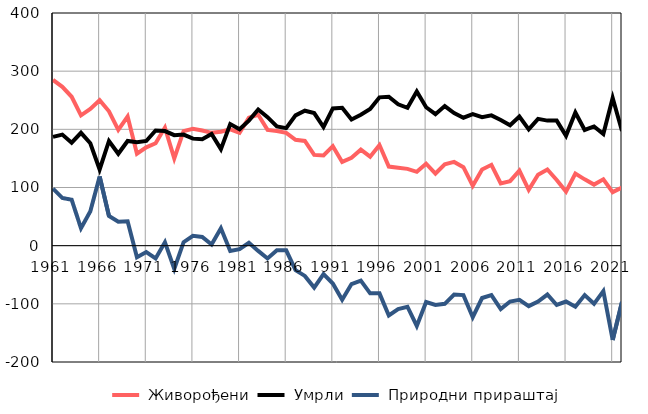
| Category |  Живорођени |  Умрли |  Природни прираштај |
|---|---|---|---|
| 1961.0 | 285 | 187 | 98 |
| 1962.0 | 273 | 191 | 82 |
| 1963.0 | 256 | 177 | 79 |
| 1964.0 | 224 | 194 | 30 |
| 1965.0 | 235 | 176 | 59 |
| 1966.0 | 250 | 131 | 119 |
| 1967.0 | 231 | 180 | 51 |
| 1968.0 | 199 | 158 | 41 |
| 1969.0 | 222 | 180 | 42 |
| 1970.0 | 158 | 178 | -20 |
| 1971.0 | 169 | 180 | -11 |
| 1972.0 | 176 | 198 | -22 |
| 1973.0 | 203 | 197 | 6 |
| 1974.0 | 150 | 190 | -40 |
| 1975.0 | 197 | 191 | 6 |
| 1976.0 | 201 | 184 | 17 |
| 1977.0 | 198 | 183 | 15 |
| 1978.0 | 194 | 192 | 2 |
| 1979.0 | 196 | 166 | 30 |
| 1980.0 | 200 | 209 | -9 |
| 1981.0 | 194 | 200 | -6 |
| 1982.0 | 220 | 215 | 5 |
| 1983.0 | 225 | 234 | -9 |
| 1984.0 | 199 | 221 | -22 |
| 1985.0 | 197 | 205 | -8 |
| 1986.0 | 194 | 202 | -8 |
| 1987.0 | 182 | 224 | -42 |
| 1988.0 | 180 | 232 | -52 |
| 1989.0 | 156 | 228 | -72 |
| 1990.0 | 155 | 204 | -49 |
| 1991.0 | 171 | 236 | -65 |
| 1992.0 | 144 | 237 | -93 |
| 1993.0 | 151 | 217 | -66 |
| 1994.0 | 165 | 225 | -60 |
| 1995.0 | 153 | 235 | -82 |
| 1996.0 | 173 | 255 | -82 |
| 1997.0 | 136 | 256 | -120 |
| 1998.0 | 134 | 243 | -109 |
| 1999.0 | 132 | 237 | -105 |
| 2000.0 | 127 | 265 | -138 |
| 2001.0 | 141 | 238 | -97 |
| 2002.0 | 124 | 226 | -102 |
| 2003.0 | 140 | 240 | -100 |
| 2004.0 | 144 | 228 | -84 |
| 2005.0 | 135 | 220 | -85 |
| 2006.0 | 103 | 226 | -123 |
| 2007.0 | 131 | 221 | -90 |
| 2008.0 | 139 | 224 | -85 |
| 2009.0 | 107 | 216 | -109 |
| 2010.0 | 111 | 207 | -96 |
| 2011.0 | 129 | 222 | -93 |
| 2012.0 | 96 | 200 | -104 |
| 2013.0 | 122 | 218 | -96 |
| 2014.0 | 131 | 215 | -84 |
| 2015.0 | 113 | 215 | -102 |
| 2016.0 | 93 | 189 | -96 |
| 2017.0 | 124 | 229 | -105 |
| 2018.0 | 114 | 199 | -85 |
| 2019.0 | 105 | 205 | -100 |
| 2020.0 | 114 | 192 | -78 |
| 2021.0 | 92 | 254 | -162 |
| 2022.0 | 100 | 197 | -97 |